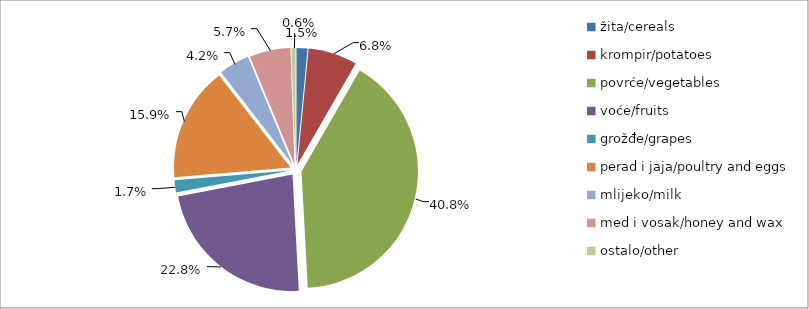
| Category | Series 0 |
|---|---|
| žita/cereals | 18842.5 |
| krompir/potatoes | 84168 |
| povrće/vegetables | 505000.1 |
| voće/fruits | 282647 |
| grožđe/grapes | 20772 |
| perad i jaja/poultry and eggs | 196137.512 |
| mlijeko/milk | 52491.5 |
| med i vosak/honey and wax | 70389 |
| ostalo/other | 6950 |